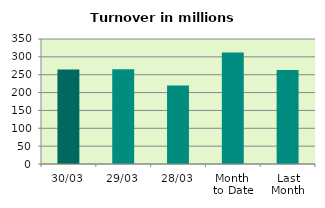
| Category | Series 0 |
|---|---|
| 30/03 | 264.429 |
| 29/03 | 265.159 |
| 28/03 | 219.478 |
| Month 
to Date | 312.356 |
| Last
Month | 263.32 |